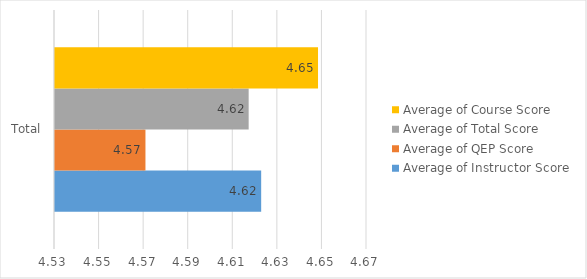
| Category | Average of Instructor Score | Average of QEP Score | Average of Total Score | Average of Course Score |
|---|---|---|---|---|
| Total | 4.623 | 4.571 | 4.617 | 4.648 |